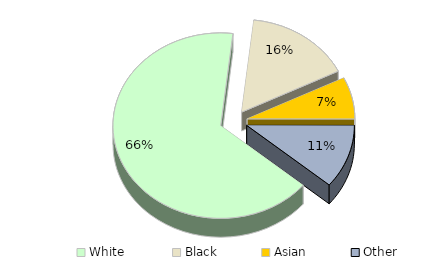
| Category | New York |
|---|---|
| White  | 0.657 |
| Black | 0.159 |
| Asian | 0.073 |
| Other | 0.111 |